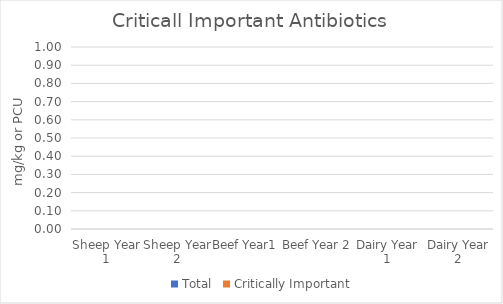
| Category | Total | Critically Important |
|---|---|---|
| Sheep Year 1 | 0 | 0 |
| Sheep Year 2 | 0 | 0 |
| Beef Year1  | 0 | 0 |
| Beef Year 2 | 0 | 0 |
| Dairy Year 1 | 0 | 0 |
| Dairy Year 2 | 0 | 0 |